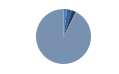
| Category | Series 0 |
|---|---|
| ARRASTRE | 13 |
| CERCO | 16 |
| PALANGRE | 16 |
| REDES DE ENMALLE | 0 |
| ARTES FIJAS | 1 |
| ARTES MENORES | 549 |